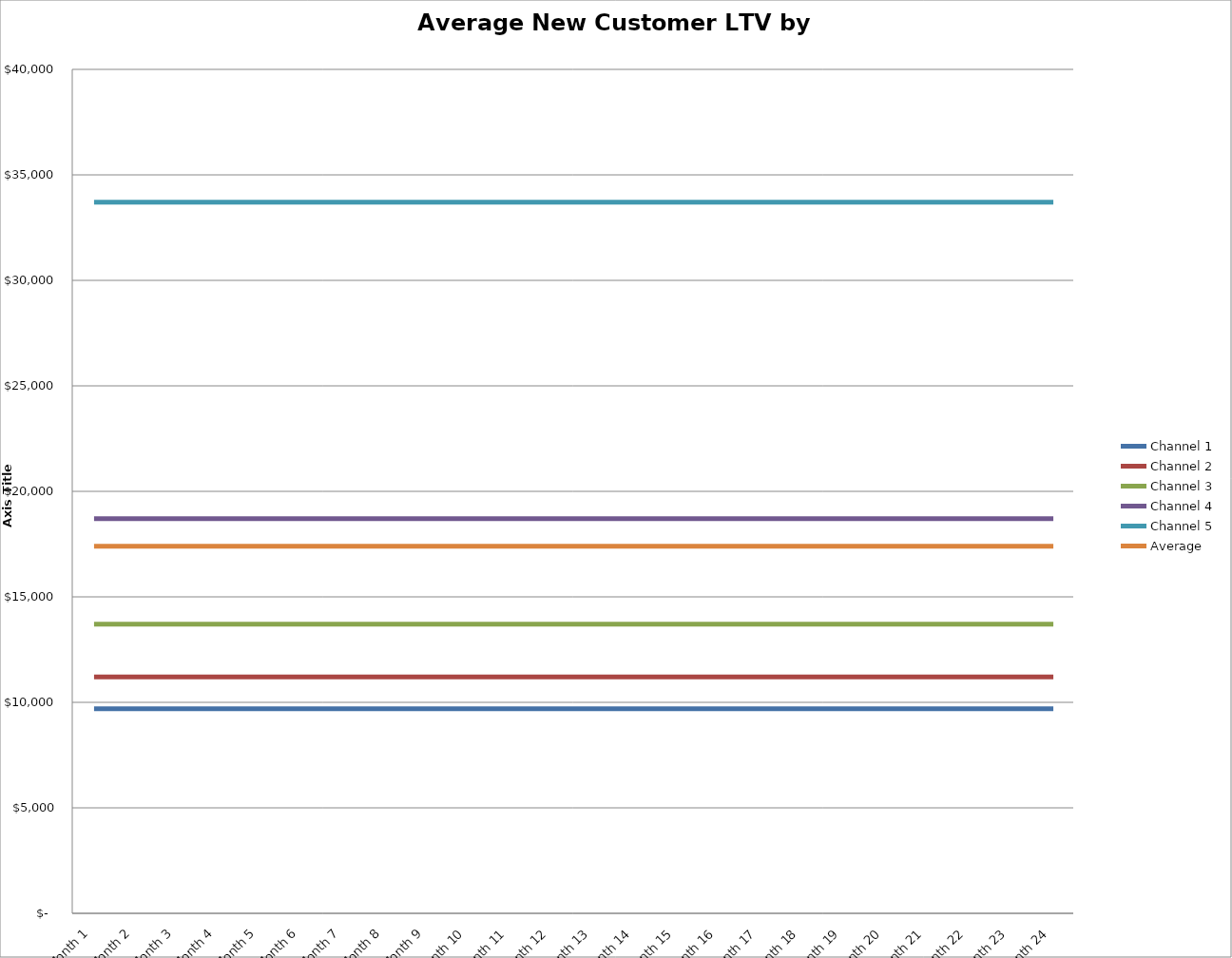
| Category | Channel 1 | Channel 2 | Channel 3 | Channel 4 | Channel 5 | Average |
|---|---|---|---|---|---|---|
| Month 1 | 9700 | 11200 | 13700 | 18700 | 33700 | 17400 |
| Month 2 | 9700 | 11200 | 13700 | 18700 | 33700 | 17400 |
| Month 3 | 9700 | 11200 | 13700 | 18700 | 33700 | 17400 |
| Month 4 | 9700 | 11200 | 13700 | 18700 | 33700 | 17400 |
| Month 5 | 9700 | 11200 | 13700 | 18700 | 33700 | 17400 |
| Month 6 | 9700 | 11200 | 13700 | 18700 | 33700 | 17400 |
| Month 7 | 9700 | 11200 | 13700 | 18700 | 33700 | 17400 |
| Month 8 | 9700 | 11200 | 13700 | 18700 | 33700 | 17400 |
| Month 9 | 9700 | 11200 | 13700 | 18700 | 33700 | 17400 |
| Month 10 | 9700 | 11200 | 13700 | 18700 | 33700 | 17400 |
| Month 11 | 9700 | 11200 | 13700 | 18700 | 33700 | 17400 |
| Month 12 | 9700 | 11200 | 13700 | 18700 | 33700 | 17400 |
| Month 13 | 9700 | 11200 | 13700 | 18700 | 33700 | 17400 |
| Month 14 | 9700 | 11200 | 13700 | 18700 | 33700 | 17400 |
| Month 15 | 9700 | 11200 | 13700 | 18700 | 33700 | 17400 |
| Month 16 | 9700 | 11200 | 13700 | 18700 | 33700 | 17400 |
| Month 17 | 9700 | 11200 | 13700 | 18700 | 33700 | 17400 |
| Month 18 | 9700 | 11200 | 13700 | 18700 | 33700 | 17400 |
| Month 19 | 9700 | 11200 | 13700 | 18700 | 33700 | 17400 |
| Month 20 | 9700 | 11200 | 13700 | 18700 | 33700 | 17400 |
| Month 21 | 9700 | 11200 | 13700 | 18700 | 33700 | 17400 |
| Month 22 | 9700 | 11200 | 13700 | 18700 | 33700 | 17400 |
| Month 23 | 9700 | 11200 | 13700 | 18700 | 33700 | 17400 |
| Month 24 | 9700 | 11200 | 13700 | 18700 | 33700 | 17400 |